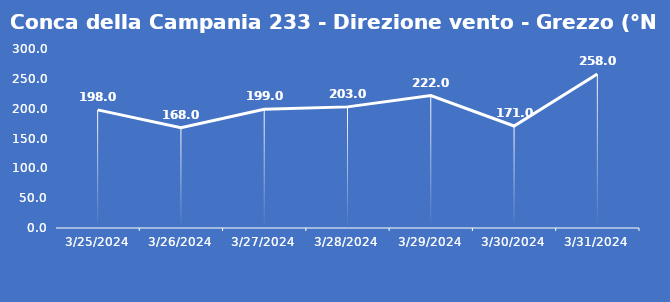
| Category | Conca della Campania 233 - Direzione vento - Grezzo (°N) |
|---|---|
| 3/25/24 | 198 |
| 3/26/24 | 168 |
| 3/27/24 | 199 |
| 3/28/24 | 203 |
| 3/29/24 | 222 |
| 3/30/24 | 171 |
| 3/31/24 | 258 |